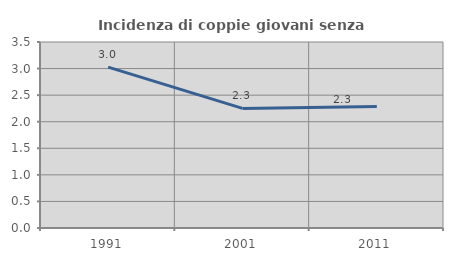
| Category | Incidenza di coppie giovani senza figli |
|---|---|
| 1991.0 | 3.026 |
| 2001.0 | 2.251 |
| 2011.0 | 2.286 |